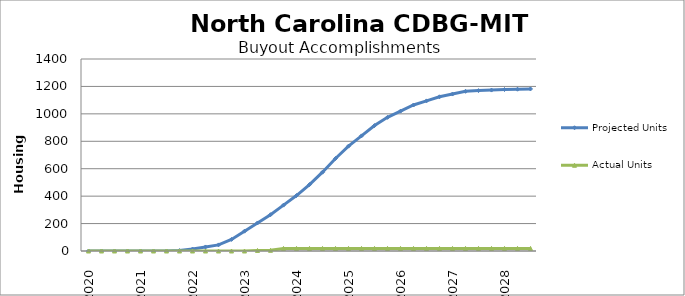
| Category | Projected Units | Actual Units |
|---|---|---|
| 01/2020 | 0 | 0 |
| 04/2020 | 0 | 0 |
| 07/2020 | 0 | 0 |
| 10/2020 | 0 | 0 |
| 01/2021 | 0 | 0 |
| 04/2021 | 0 | 0 |
| 07/2021 | 0 | 0 |
| 10/2021 | 3 | 0 |
| 01/2022 | 14.5 | 0 |
| 04/2022 | 29.5 | 0 |
| 07/2022 | 44.5 | 0 |
| 10/2022 | 84.5 | 0 |
| 01/2023 | 144.5 | 0 |
| 04/2023 | 204.5 | 4 |
| 07/2023 | 264.5 | 5 |
| 10/2023 | 334.5 | 19 |
| 01/2024 | 404.5 | 19 |
| 04/2024 | 484.5 | 19 |
| 07/2024 | 574.5 | 19 |
| 10/2024 | 674.5 | 19 |
| 01/2025 | 764.5 | 19 |
| 04/2025 | 839.5 | 19 |
| 07/2025 | 914.5 | 19 |
| 10/2025 | 974.5 | 19 |
| 01/2026 | 1019.5 | 19 |
| 04/2026 | 1064.5 | 19 |
| 07/2026 | 1094.5 | 19 |
| 10/2026 | 1124.5 | 19 |
| 01/2027 | 1144.5 | 19 |
| 04/2027 | 1164.5 | 19 |
| 07/2027 | 1169.5 | 19 |
| 10/2027 | 1173.5 | 19 |
| 01/2028 | 1177.5 | 19 |
| 04/2028 | 1179.5 | 19 |
| 07/2028 | 1181.5 | 19 |